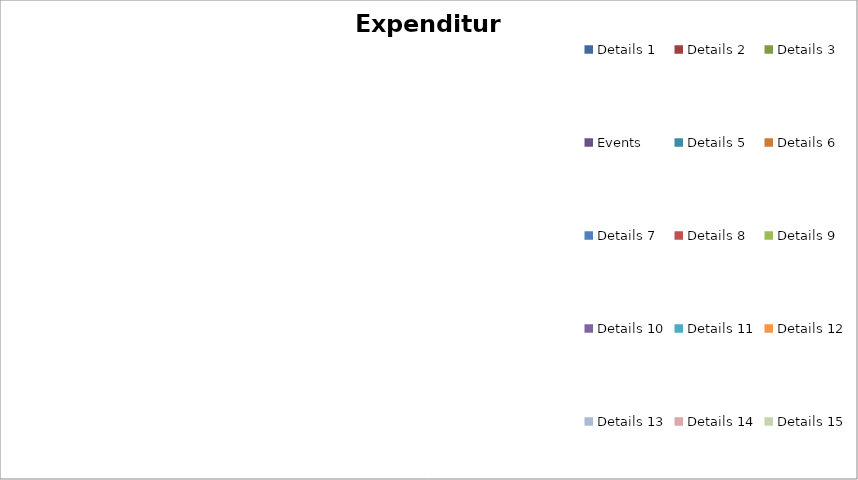
| Category | Series 0 |
|---|---|
| Details 1 | 0 |
| Details 2 | 0 |
| Details 3 | 0 |
| Events | 0 |
| Details 5 | 0 |
| Details 6 | 0 |
| Details 7 | 0 |
| Details 8 | 0 |
| Details 9 | 0 |
| Details 10 | 0 |
| Details 11 | 0 |
| Details 12 | 0 |
| Details 13 | 0 |
| Details 14 | 0 |
| Details 15 | 0 |